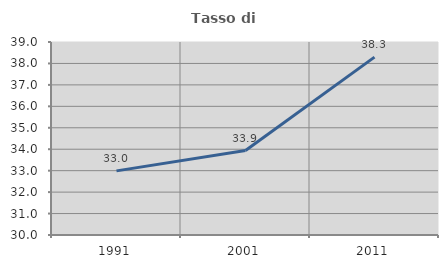
| Category | Tasso di occupazione   |
|---|---|
| 1991.0 | 32.991 |
| 2001.0 | 33.939 |
| 2011.0 | 38.296 |